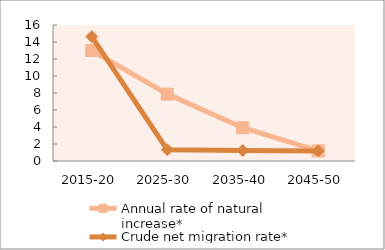
| Category | Annual rate of natural increase* | Crude net migration rate* |
|---|---|---|
| 2015-20 | 13.001 | 14.635 |
| 2025-30 | 7.871 | 1.327 |
| 2035-40 | 3.91 | 1.236 |
| 2045-50 | 1.189 | 1.191 |